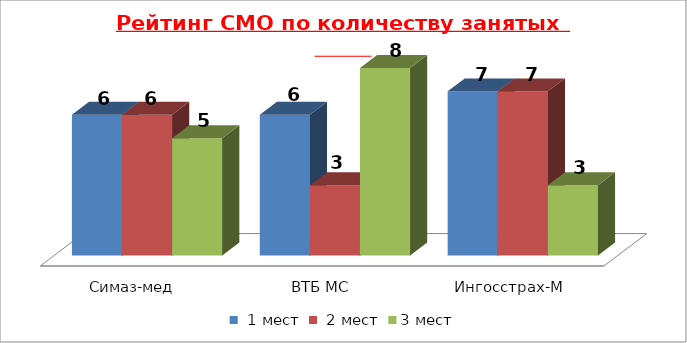
| Category |  1 мест |  2 мест | 3 мест |
|---|---|---|---|
| Симаз-мед | 6 | 6 | 5 |
| ВТБ МС | 6 | 3 | 8 |
| Ингосстрах-М | 7 | 7 | 3 |